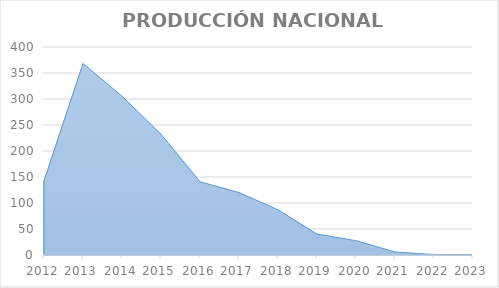
| Category | Series 0 |
|---|---|
| 2012.0 | 142.766 |
| 2013.0 | 368.34 |
| 2014.0 | 305.411 |
| 2015.0 | 232.244 |
| 2016.0 | 140.895 |
| 2017.0 | 120.105 |
| 2018.0 | 86.991 |
| 2019.0 | 40.245 |
| 2020.0 | 27.536 |
| 2021.0 | 5.816 |
| 2022.0 | 0.912 |
| 2023.0 | 0.672 |